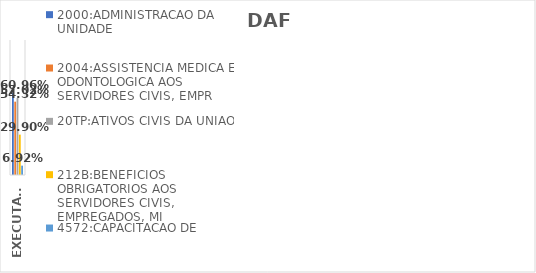
| Category | 2000:ADMINISTRACAO DA UNIDADE | 2004:ASSISTENCIA MEDICA E ODONTOLOGICA AOS SERVIDORES CIVIS, EMPR | 20TP:ATIVOS CIVIS DA UNIAO | 212B:BENEFICIOS OBRIGATORIOS AOS SERVIDORES CIVIS, EMPREGADOS, MI | 4572:CAPACITACAO DE SERVIDORES PUBLICOS FEDERAIS EM PROCESSO DE Q |
|---|---|---|---|---|---|
| EXECUTADO | 0.61 | 0.543 | 0.57 | 0.299 | 0.069 |